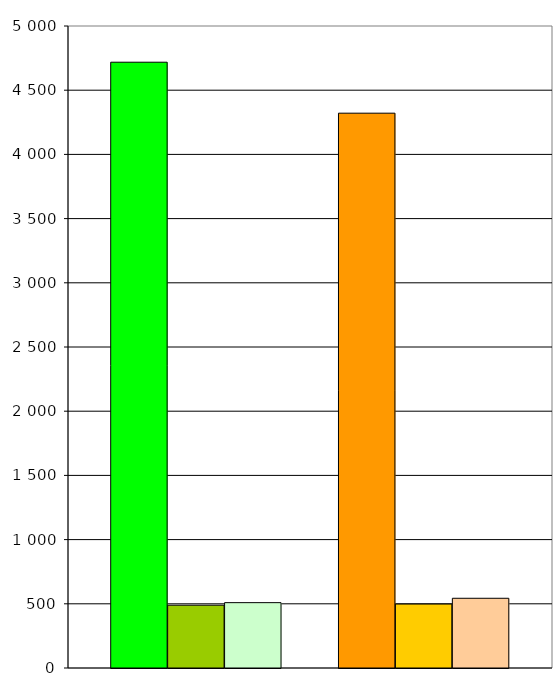
| Category | Series 0 | Series 1 | Series 2 | Series 3 | Series 4 | Series 5 | Series 6 |
|---|---|---|---|---|---|---|---|
| 0 | 4718 | 489 | 509 |  | 4321 | 498 | 543 |